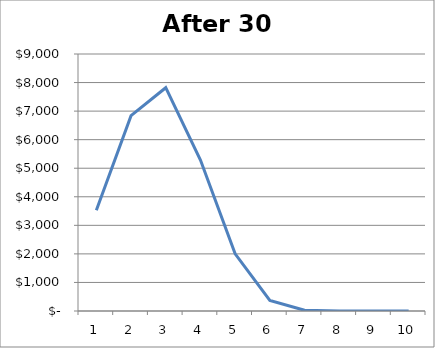
| Category | Series 0 |
|---|---|
| 0 | 3524.632 |
| 1 | 6841.957 |
| 2 | 7819.38 |
| 3 | 5286.949 |
| 4 | 2000 |
| 5 | 367.435 |
| 6 | 24.147 |
| 7 | 0.275 |
| 8 | 0 |
| 9 | 0 |